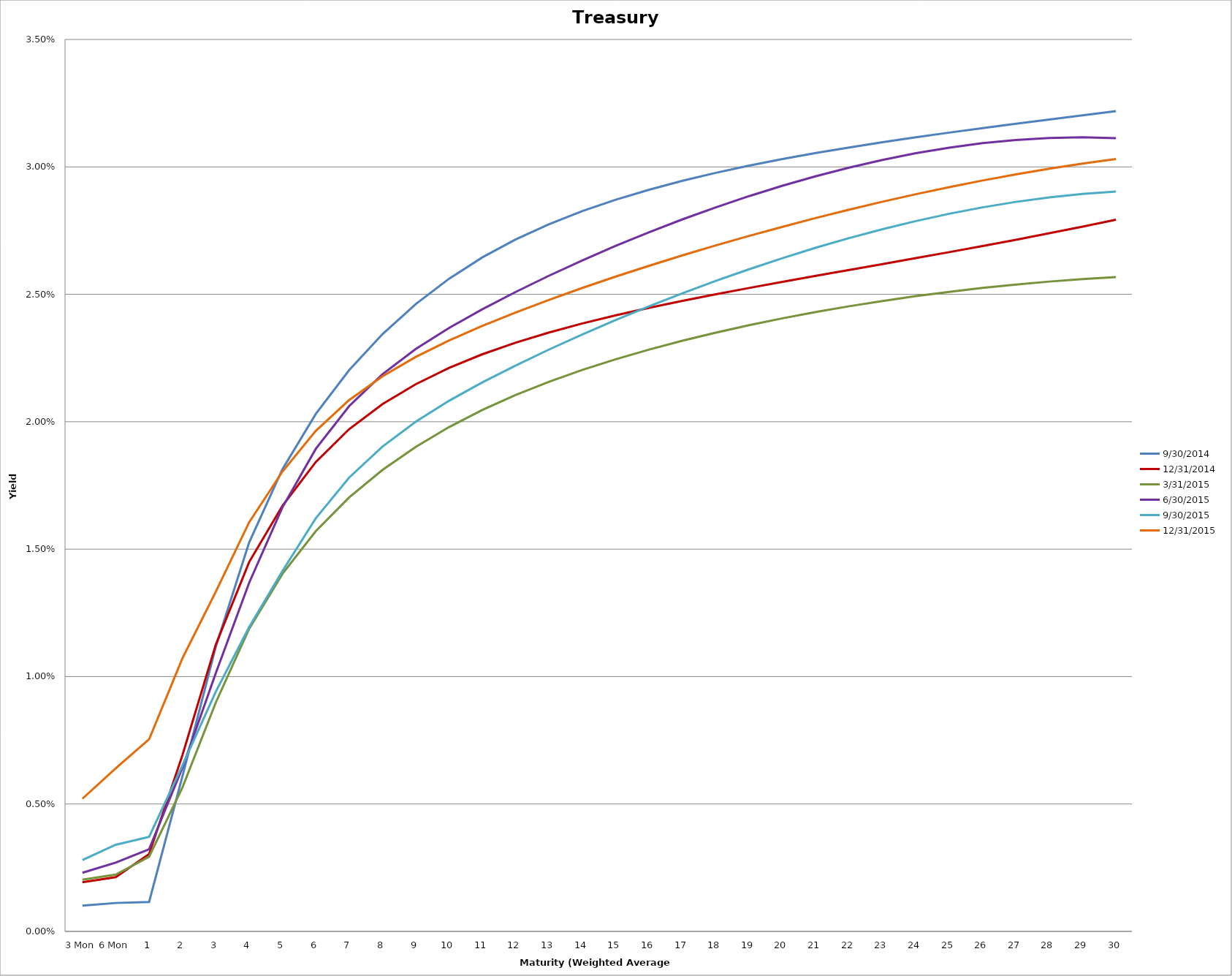
| Category | 9/30/2014 | 12/31/2014 | 3/31/2015 | 6/30/2015 | 9/30/2015 | 12/31/2015 |
|---|---|---|---|---|---|---|
| 3 Mon | 0.001 | 0.002 | 0.002 | 0.002 | 0.003 | 0.005 |
| 6 Mon | 0.001 | 0.002 | 0.002 | 0.003 | 0.003 | 0.006 |
| 1 | 0.001 | 0.003 | 0.003 | 0.003 | 0.004 | 0.008 |
| 2 | 0.006 | 0.007 | 0.006 | 0.006 | 0.007 | 0.011 |
| 3 | 0.011 | 0.011 | 0.009 | 0.01 | 0.009 | 0.013 |
| 4 | 0.015 | 0.014 | 0.012 | 0.014 | 0.012 | 0.016 |
| 5 | 0.018 | 0.017 | 0.014 | 0.017 | 0.014 | 0.018 |
| 6 | 0.02 | 0.018 | 0.016 | 0.019 | 0.016 | 0.02 |
| 7 | 0.022 | 0.02 | 0.017 | 0.021 | 0.018 | 0.021 |
| 8 | 0.023 | 0.021 | 0.018 | 0.022 | 0.019 | 0.022 |
| 9 | 0.025 | 0.021 | 0.019 | 0.023 | 0.02 | 0.023 |
| 10 | 0.026 | 0.022 | 0.02 | 0.024 | 0.021 | 0.023 |
| 11 | 0.026 | 0.023 | 0.02 | 0.024 | 0.022 | 0.024 |
| 12 | 0.027 | 0.023 | 0.021 | 0.025 | 0.022 | 0.024 |
| 13 | 0.028 | 0.024 | 0.022 | 0.026 | 0.023 | 0.025 |
| 14 | 0.028 | 0.024 | 0.022 | 0.026 | 0.023 | 0.025 |
| 15 | 0.029 | 0.024 | 0.022 | 0.027 | 0.024 | 0.026 |
| 16 | 0.029 | 0.024 | 0.023 | 0.027 | 0.025 | 0.026 |
| 17 | 0.029 | 0.025 | 0.023 | 0.028 | 0.025 | 0.027 |
| 18 | 0.03 | 0.025 | 0.023 | 0.028 | 0.026 | 0.027 |
| 19 | 0.03 | 0.025 | 0.024 | 0.029 | 0.026 | 0.027 |
| 20 | 0.03 | 0.025 | 0.024 | 0.029 | 0.026 | 0.028 |
| 21 | 0.031 | 0.026 | 0.024 | 0.03 | 0.027 | 0.028 |
| 22 | 0.031 | 0.026 | 0.025 | 0.03 | 0.027 | 0.028 |
| 23 | 0.031 | 0.026 | 0.025 | 0.03 | 0.028 | 0.029 |
| 24 | 0.031 | 0.026 | 0.025 | 0.031 | 0.028 | 0.029 |
| 25 | 0.031 | 0.027 | 0.025 | 0.031 | 0.028 | 0.029 |
| 26 | 0.032 | 0.027 | 0.025 | 0.031 | 0.028 | 0.029 |
| 27 | 0.032 | 0.027 | 0.025 | 0.031 | 0.029 | 0.03 |
| 28 | 0.032 | 0.027 | 0.026 | 0.031 | 0.029 | 0.03 |
| 29 | 0.032 | 0.028 | 0.026 | 0.031 | 0.029 | 0.03 |
| 30 | 0.032 | 0.028 | 0.026 | 0.031 | 0.029 | 0.03 |